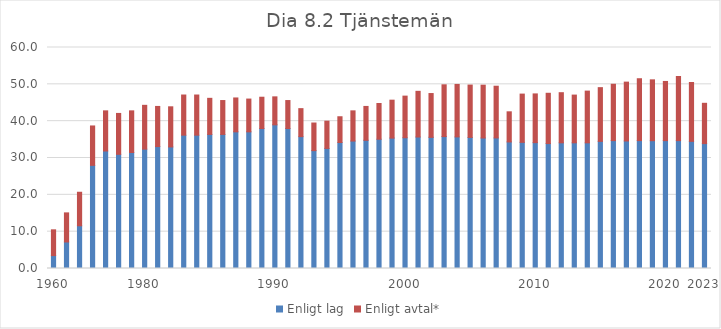
| Category | Enligt lag | Enligt avtal* |
|---|---|---|
| 1960 | 3.5 | 7 |
|  | 7.2 | 7.9 |
|  | 11.6 | 9.1 |
|  | 28 | 10.7 |
|  | 31.9 | 10.9 |
|  | 31 | 11.1 |
|  | 31.5 | 11.3 |
| 1980 | 32.4 | 11.9 |
|  | 33.1 | 10.9 |
|  | 33 | 10.9 |
|  | 36.2 | 10.9 |
|  | 36.2 | 10.9 |
|  | 36.4 | 9.8 |
|  | 36.4 | 9.2 |
|  | 37.1 | 9.2 |
|  | 37.1 | 8.9 |
|  | 38 | 8.5 |
| 1990 | 39 | 7.6 |
|  | 38 | 7.6 |
|  | 35.8 | 7.6 |
|  | 32 | 7.5 |
|  | 32.6 | 7.4 |
|  | 34.2 | 7 |
|  | 34.6 | 8.2 |
|  | 34.8 | 9.2 |
|  | 35.1 | 9.7 |
|  | 35.4 | 10.3 |
| 2000 | 35.5 | 11.3 |
|  | 35.7 | 12.4 |
|  | 35.6 | 11.9 |
|  | 35.82 | 14.05 |
|  | 35.73 | 14.24 |
|  | 35.59 | 14.21 |
|  | 35.43 | 14.34 |
|  | 35.45 | 14.04 |
|  | 34.36 | 8.18 |
|  | 34.25 | 13.1 |
| 2010 | 34.17 | 13.23 |
|  | 33.92 | 13.65 |
|  | 34.12 | 13.61 |
|  | 34.12 | 12.96 |
|  | 34.12 | 14.04 |
|  | 34.52 | 14.58 |
|  | 34.72 | 15.3 |
|  | 34.62 | 15.98 |
|  | 34.72 | 16.8 |
|  | 34.7 | 16.52 |
| 2020 | 34.72 | 16.06 |
|  | 34.72 | 17.41 |
|  | 34.52 | 15.98 |
| 2023 | 33.91 | 10.94 |